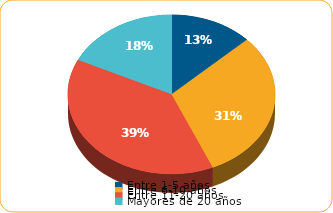
| Category | Series 0 |
|---|---|
| Entre 1-5 años | 1644.4 |
| Entre 6-10 años | 3882 |
| Entre 11-20 años | 4909.4 |
| Mayores de 20 años | 2269.5 |